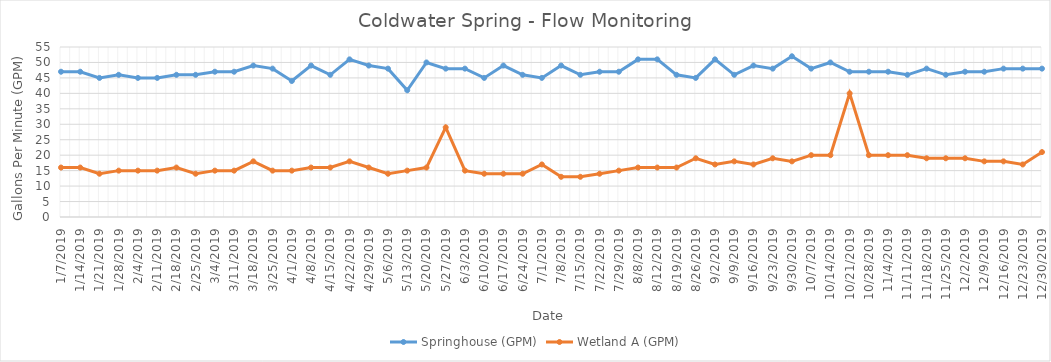
| Category | Springhouse (GPM) | Wetland A (GPM) |
|---|---|---|
| 1/7/19 | 47 | 16 |
| 1/14/19 | 47 | 16 |
| 1/21/19 | 45 | 14 |
| 1/28/19 | 46 | 15 |
| 2/4/19 | 45 | 15 |
| 2/11/19 | 45 | 15 |
| 2/18/19 | 46 | 16 |
| 2/25/19 | 46 | 14 |
| 3/4/19 | 47 | 15 |
| 3/11/19 | 47 | 15 |
| 3/18/19 | 49 | 18 |
| 3/25/19 | 48 | 15 |
| 4/1/19 | 44 | 15 |
| 4/8/19 | 49 | 16 |
| 4/15/19 | 46 | 16 |
| 4/22/19 | 51 | 18 |
| 4/29/19 | 49 | 16 |
| 5/6/19 | 48 | 14 |
| 5/13/19 | 41 | 15 |
| 5/20/19 | 50 | 16 |
| 5/27/19 | 48 | 29 |
| 6/3/19 | 48 | 15 |
| 6/10/19 | 45 | 14 |
| 6/17/19 | 49 | 14 |
| 6/24/19 | 46 | 14 |
| 7/1/19 | 45 | 17 |
| 7/8/19 | 49 | 13 |
| 7/15/19 | 46 | 13 |
| 7/22/19 | 47 | 14 |
| 7/29/19 | 47 | 15 |
| 8/8/19 | 51 | 16 |
| 8/12/19 | 51 | 16 |
| 8/19/19 | 46 | 16 |
| 8/26/19 | 45 | 19 |
| 9/2/19 | 51 | 17 |
| 9/9/19 | 46 | 18 |
| 9/16/19 | 49 | 17 |
| 9/23/19 | 48 | 19 |
| 9/30/19 | 52 | 18 |
| 10/7/19 | 48 | 20 |
| 10/14/19 | 50 | 20 |
| 10/21/19 | 47 | 40 |
| 10/28/19 | 47 | 20 |
| 11/4/19 | 47 | 20 |
| 11/11/19 | 46 | 20 |
| 11/18/19 | 48 | 19 |
| 11/25/19 | 46 | 19 |
| 12/2/19 | 47 | 19 |
| 12/9/19 | 47 | 18 |
| 12/16/19 | 48 | 18 |
| 12/23/19 | 48 | 17 |
| 12/30/19 | 48 | 21 |